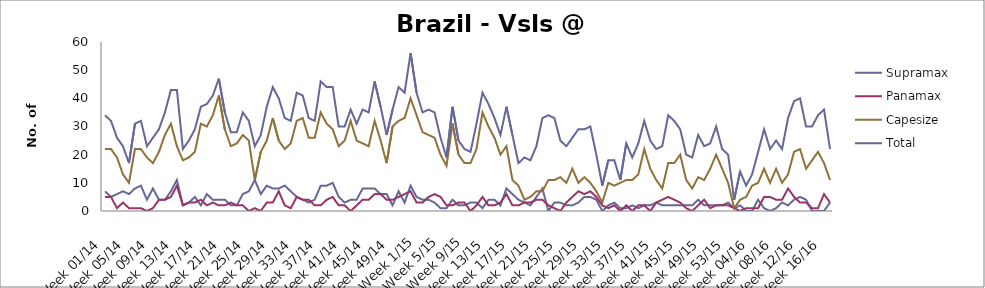
| Category | Supramax | Panamax | Capesize | Total |
|---|---|---|---|---|
| Week 01/14 | 7 | 5 | 22 | 34 |
| Week 02/14 | 5 | 5 | 22 | 32 |
| Week 03/14 | 6 | 1 | 19 | 26 |
| Week 04/14 | 7 | 3 | 13 | 23 |
| Week 05/14 | 6 | 1 | 10 | 17 |
| Week 06/14 | 8 | 1 | 22 | 31 |
| Week 07/14 | 9 | 1 | 22 | 32 |
| Week 08/14 | 4 | 0 | 19 | 23 |
| Week 09/14 | 8 | 1 | 17 | 26 |
| Week 10/14 | 4 | 4 | 21 | 29 |
| Week 11/14 | 4 | 4 | 27 | 35 |
| Week 12/14 | 7 | 5 | 31 | 43 |
| Week 13/14 | 11 | 9 | 23 | 43 |
| Week 14/14 | 2 | 2 | 18 | 22 |
| Week 15/14 | 3 | 3 | 19 | 25 |
| Week 16/14 | 5 | 3 | 21 | 29 |
| Week 17/14 | 2 | 4 | 31 | 37 |
| Week 18/14 | 6 | 2 | 30 | 38 |
| Week 19/14 | 4 | 3 | 34 | 41 |
| Week 20/14 | 4 | 2 | 41 | 47 |
| Week 21/14 | 4 | 2 | 29 | 35 |
| Week 22/14 | 2 | 3 | 23 | 28 |
| Week 23/14 | 2 | 2 | 24 | 28 |
| Week 24/14 | 6 | 2 | 27 | 35 |
| Week 25/14 | 7 | 0 | 25 | 32 |
| Week 26/14 | 11 | 1 | 11 | 23 |
| Week 27/14 | 6 | 0 | 21 | 27 |
| Week 28/14 | 9 | 3 | 25 | 37 |
| Week 29/14 | 8 | 3 | 33 | 44 |
| Week 30/14 | 8 | 7 | 25 | 40 |
| Week 31/14 | 9 | 2 | 22 | 33 |
| Week 32/14 | 7 | 1 | 24 | 32 |
| Week 33/14 | 5 | 5 | 32 | 42 |
| Week 34/14 | 4 | 4 | 33 | 41 |
| Week 35/14 | 3 | 4 | 26 | 33 |
| Week 36/14 | 4 | 2 | 26 | 32 |
| Week 37/14 | 9 | 2 | 35 | 46 |
| Week 38/14 | 9 | 4 | 31 | 44 |
| Week 39/14 | 10 | 5 | 29 | 44 |
| Week 40/14 | 5 | 2 | 23 | 30 |
| Week 41/14 | 3 | 2 | 25 | 30 |
| Week 42/14 | 4 | 0 | 32 | 36 |
| Week 43/14 | 4 | 2 | 25 | 31 |
| Week 44/14 | 8 | 4 | 24 | 36 |
| Week 45/14 | 8 | 4 | 23 | 35 |
| Week 46/14 | 8 | 6 | 32 | 46 |
| Week 47/14 | 6 | 6 | 25 | 37 |
| Week 48/14 | 6 | 4 | 17 | 27 |
| Week 49/14 | 2 | 4 | 30 | 36 |
| Week 50/14 | 7 | 5 | 32 | 44 |
| Week 51/14 | 3 | 6 | 33 | 42 |
| Week 52/14 | 9 | 7 | 40 | 56 |
| Week 1/15 | 5 | 3 | 34 | 42 |
| Week 2/15 | 4 | 3 | 28 | 35 |
| Week 3/15 | 4 | 5 | 27 | 36 |
| Week 4/15 | 3 | 6 | 26 | 35 |
| Week 5/15 | 1 | 5 | 20 | 26 |
| Week 6/15 | 1 | 2 | 16 | 19 |
| Week 7/15 | 4 | 2 | 31 | 37 |
| Week 8/15 | 2 | 3 | 20 | 25 |
| Week 9/15 | 2 | 3 | 17 | 22 |
| Week 10/15 | 3 | 0 | 17 | 21 |
| Week 11/15 | 3 | 2 | 22 | 31 |
| Week 12/15 | 1 | 5 | 35 | 42 |
| Week 13/15 | 4 | 2 | 30 | 38 |
| Week 14/15 | 4 | 2 | 26 | 33 |
| Week 15/15 | 2 | 3 | 20 | 27 |
| Week 16/15 | 8 | 6 | 23 | 37 |
| Week 17/15 | 6 | 2 | 11 | 27 |
| Week 18/15 | 4 | 2 | 9 | 17 |
| Week 19/15 | 3 | 3 | 4 | 19 |
| Week 20/15 | 2 | 3 | 5 | 18 |
| Week 21/15 | 5 | 4 | 7 | 23 |
| Week 22/15 | 8 | 4 | 7 | 33 |
| Week 23/15 | 0 | 2 | 11 | 34 |
| Week 24/15 | 3 | 1 | 11 | 33 |
| Week 25/15 | 3 | 0 | 12 | 25 |
| Week 26/15 | 2 | 3 | 10 | 23 |
| Week 27/15 | 2 | 5 | 15 | 26 |
| Week 28/15 | 3 | 7 | 10 | 29 |
| Week 29/15 | 5 | 6 | 12 | 29 |
| Week 30/15 | 5 | 7 | 10 | 30 |
| Week 31/15 | 4 | 5 | 7 | 20 |
| Week 32/15 | 0 | 2 | 3 | 9 |
| Week 33/15 | 2 | 1 | 10 | 18 |
| Week 34/15 | 3 | 2 | 9 | 18 |
| Week 35/15 | 1 | 0 | 10 | 11 |
| Week 36/15 | 1 | 2 | 11 | 24 |
| Week 37/15 | 2 | 0 | 11 | 19 |
| Week 38/15 | 1 | 2 | 13 | 24 |
| Week 39/15 | 2 | 2 | 22 | 32 |
| Week 40/15 | 2 | 0 | 15 | 25 |
| Week 41/15 | 3 | 3 | 11 | 22 |
| Week 42/15 | 2 | 4 | 8 | 23 |
| Week 43/15 | 2 | 5 | 17 | 34 |
| Week 44/15 | 2 | 4 | 17 | 32 |
| Week 45/15 | 2 | 3 | 20 | 29 |
| Week 46/15 | 2 | 1 | 11 | 20 |
| Week 47/15 | 2 | 0 | 8 | 19 |
| Week 48/15 | 4 | 2 | 12 | 27 |
| Week 49/15 | 2 | 4 | 11 | 23 |
| Week 50/15 | 2 | 1 | 15 | 24 |
| Week 51/15 | 2 | 2 | 20 | 30 |
| Week 52/15 | 2 | 2 | 15 | 22 |
| Week 53/15 | 3 | 2 | 10 | 20 |
| Week 01/16 | 1 | 1 | 1 | 4 |
| Week 02/16 | 2 | 0 | 4 | 14 |
| Week 03/16 | 0 | 1 | 5 | 9 |
| Week 04/16 | 0 | 1 | 9 | 13 |
| Week 05/16 | 4 | 1 | 10 | 21 |
| Week 06/16 | 1 | 5 | 15 | 29 |
| Week 07/16 | 0 | 5 | 10 | 22 |
| Week 08/16 | 1 | 4 | 15 | 25 |
| Week 09/16 | 3 | 4 | 10 | 22 |
| Week 10/16 | 2 | 8 | 13 | 33 |
| Week 11/16 | 4 | 5 | 21 | 39 |
| Week 12/16 | 5 | 3 | 22 | 40 |
| Week 13/16 | 4 | 3 | 15 | 30 |
| Week 14/16 | 0 | 1 | 18 | 30 |
| Week 15/16 | 0 | 1 | 21 | 34 |
| Week 16/16 | 0 | 6 | 17 | 36 |
| Week 17/16 | 3 | 3 | 11 | 22 |